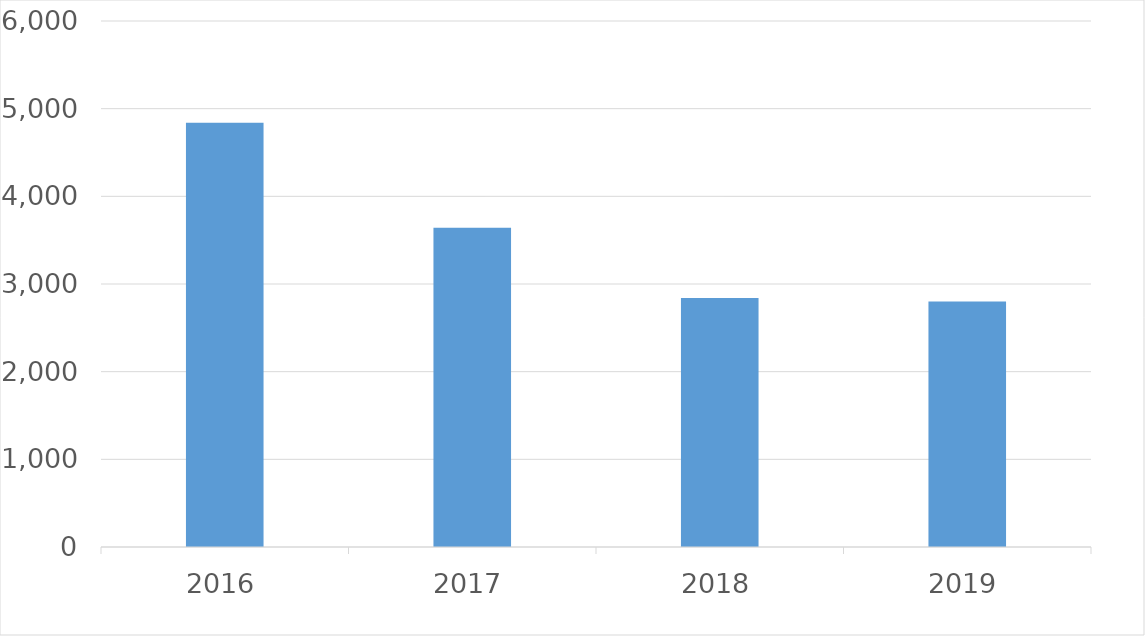
| Category | Series 0 |
|---|---|
| 2016 | 4839 |
| 2017 | 3643 |
| 2018 | 2841 |
| 2019 | 2801 |